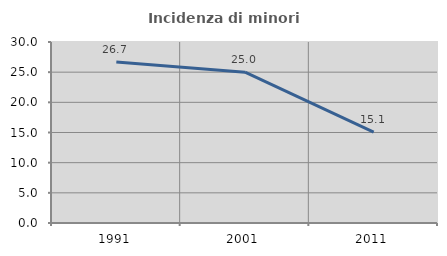
| Category | Incidenza di minori stranieri |
|---|---|
| 1991.0 | 26.667 |
| 2001.0 | 25 |
| 2011.0 | 15.054 |